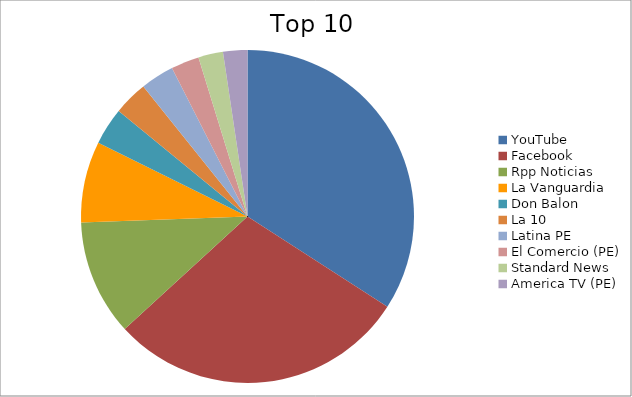
| Category | Series 0 |
|---|---|
| YouTube | 18.08 |
| Facebook | 15.4 |
| Rpp Noticias | 5.95 |
| La Vanguardia | 4.18 |
| Don Balon | 1.91 |
| La 10 | 1.76 |
| Latina PE | 1.73 |
| El Comercio (PE) | 1.45 |
| Standard News | 1.27 |
| America TV (PE) | 1.25 |